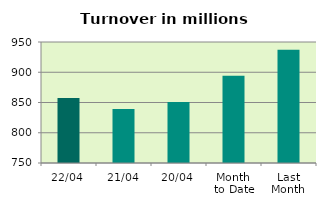
| Category | Series 0 |
|---|---|
| 22/04 | 857.517 |
| 21/04 | 839.161 |
| 20/04 | 850.783 |
| Month 
to Date | 894.083 |
| Last
Month | 937.305 |